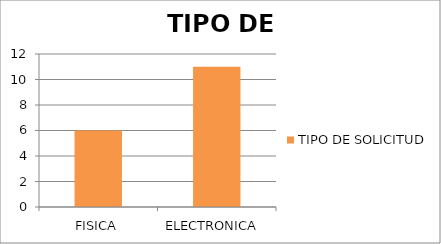
| Category | TIPO DE SOLICITUD  |
|---|---|
| FISICA | 6 |
| ELECTRONICA  | 11 |